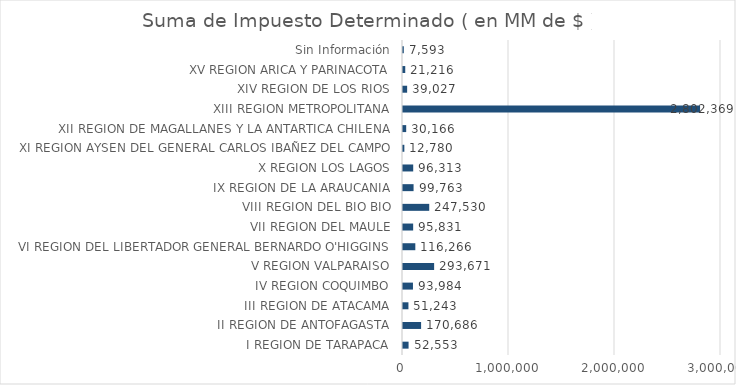
| Category | Series 0 |
|---|---|
|    I REGION DE TARAPACA | 52552.6 |
|   II REGION DE ANTOFAGASTA | 170685.7 |
|  III REGION DE ATACAMA | 51243.1 |
|   IV REGION COQUIMBO | 93983.9 |
|    V REGION VALPARAISO | 293670.8 |
|   VI REGION DEL LIBERTADOR GENERAL BERNARDO O'HIGGINS | 116265.7 |
|  VII REGION DEL MAULE | 95831.1 |
| VIII REGION DEL BIO BIO | 247530.3 |
|   IX REGION DE LA ARAUCANIA | 99763.1 |
|    X REGION LOS LAGOS | 96312.8 |
|   XI REGION AYSEN DEL GENERAL CARLOS IBAÑEZ DEL CAMPO | 12779.9 |
|  XII REGION DE MAGALLANES Y LA ANTARTICA CHILENA | 30166.3 |
| XIII REGION METROPOLITANA | 2802369 |
|  XIV REGION DE LOS RIOS | 39026.9 |
|   XV REGION ARICA Y PARINACOTA | 21215.9 |
| Sin Información | 7592.9 |